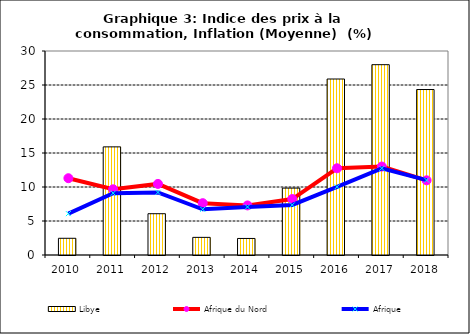
| Category | Libye |
|---|---|
| 2010.0 | 2.458 |
| 2011.0 | 15.902 |
| 2012.0 | 6.072 |
| 2013.0 | 2.594 |
| 2014.0 | 2.433 |
| 2015.0 | 9.839 |
| 2016.0 | 25.881 |
| 2017.0 | 27.988 |
| 2018.0 | 24.335 |